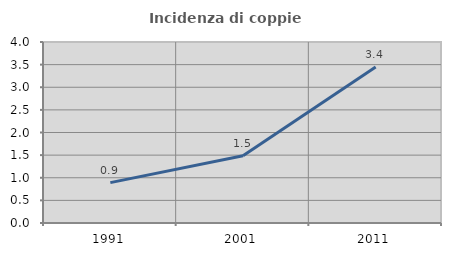
| Category | Incidenza di coppie miste |
|---|---|
| 1991.0 | 0.893 |
| 2001.0 | 1.486 |
| 2011.0 | 3.448 |